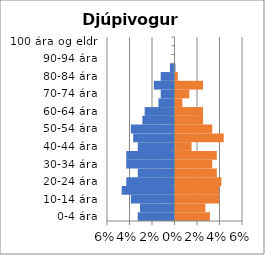
| Category | % karlar | %konur |
|---|---|---|
| 0-4 ára | -0.033 | 0.031 |
| 5-9 ára | -0.031 | 0.027 |
| 10-14 ára | -0.039 | 0.039 |
| 15-19 ára | -0.047 | 0.039 |
| 20-24 ára | -0.043 | 0.041 |
| 25-29 ára | -0.033 | 0.037 |
| 30-34 ára | -0.043 | 0.033 |
| 35-39 ára | -0.043 | 0.037 |
| 40-44 ára | -0.033 | 0.014 |
| 45-49 ára | -0.037 | 0.043 |
| 50-54 ára | -0.039 | 0.033 |
| 55-59 ára | -0.029 | 0.024 |
| 60-64 ára | -0.027 | 0.024 |
| 65-69 ára | -0.014 | 0.006 |
| 70-74 ára | -0.012 | 0.012 |
| 75-79 ára | -0.018 | 0.024 |
| 80-84 ára | -0.012 | 0.002 |
| 85-89 ára | -0.004 | 0 |
| 90-94 ára | 0 | 0 |
| 95-99 ára | 0 | 0 |
| 100 ára og eldri | 0 | 0 |